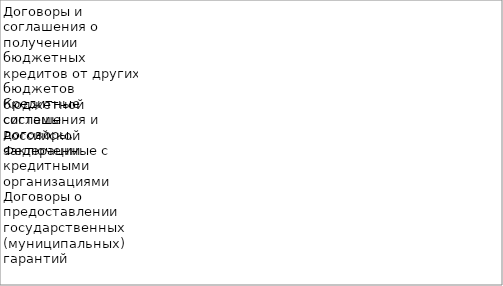
| Category | Договоры и соглашения о получении бюджетных кредитов от других бюджетов бюджетной системы Российской Федерации | Кредитные соглашения и договоры, заключенные с кредитными организациями | Договоры о предоставлении государственных (муниципальных) гарантий | Ценные бумаги |
|---|---|---|---|---|
| 0 | 21404.9 | 15000 | 0 | 0 |
| 1 | 11529.3 | 15000 | 0 | 0 |
| 2 | 10153.7 | 0 | 0 | 0 |
| 3 | 18578.1 | 3500 | 0 | 0 |
| 4 | 33606.8 | 0 | 0 | 0 |
| 5 | 47905 | 0 | 0 | 0 |
| 6 | 26484.1 | 0 | 0 | 0 |
| 7 | 32650.3 | 0 | 0 | 0 |
| 8 | 24574.6 | 0 | 0 | 0 |
| 9 | 22038.9 | 0 | 0 | 0 |